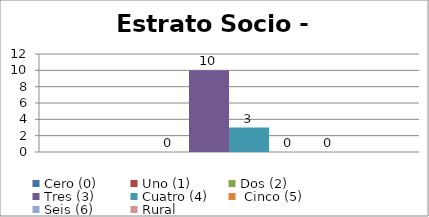
| Category | Cero (0) | Uno (1)   | Dos (2) | Tres (3) | Cuatro (4) |  Cinco (5) | Seis (6) | Rural |
|---|---|---|---|---|---|---|---|---|
| 0 |  |  | 0 | 10 | 3 | 0 | 0 |  |